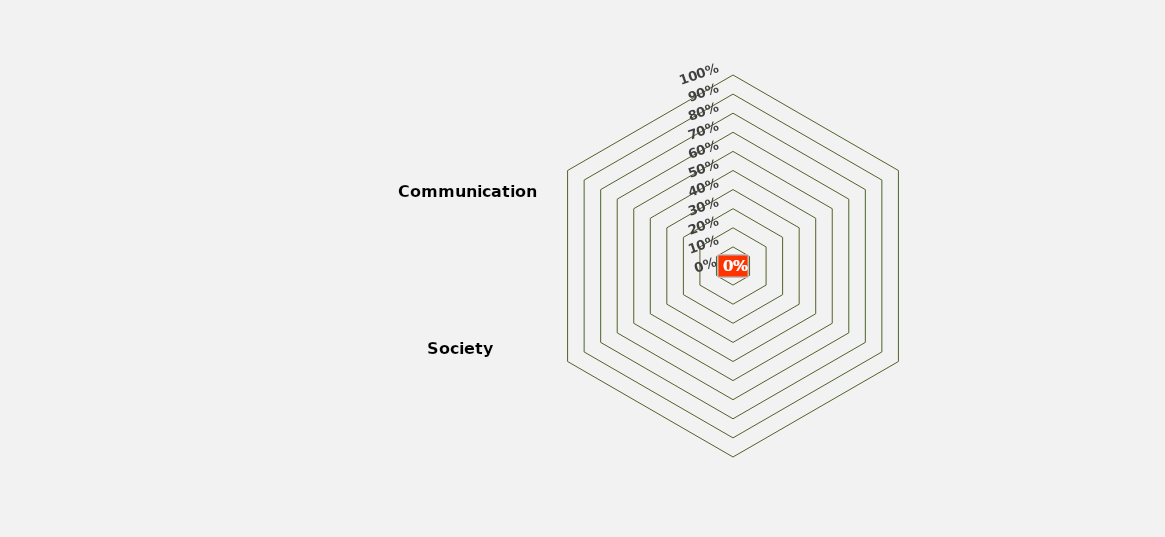
| Category | Series 1 |
|---|---|
| Strategy | 0 |
| Employees | 0 |
| Product/Service Responsibility | 0 |
| Environment | 0 |
| Society | 0 |
| Communication | 0 |